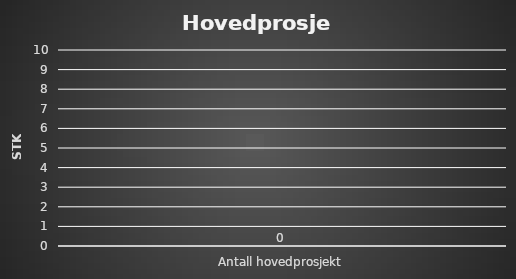
| Category | Series 0 |
|---|---|
| Antall hovedprosjekt | 0 |